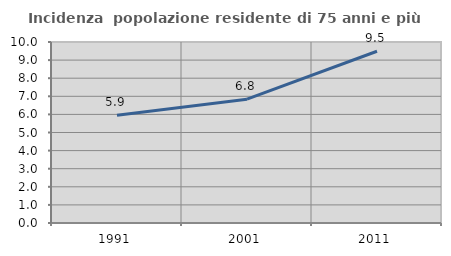
| Category | Incidenza  popolazione residente di 75 anni e più |
|---|---|
| 1991.0 | 5.948 |
| 2001.0 | 6.841 |
| 2011.0 | 9.487 |